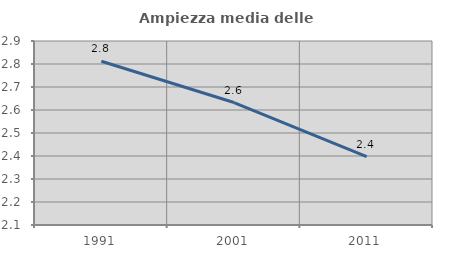
| Category | Ampiezza media delle famiglie |
|---|---|
| 1991.0 | 2.812 |
| 2001.0 | 2.633 |
| 2011.0 | 2.397 |